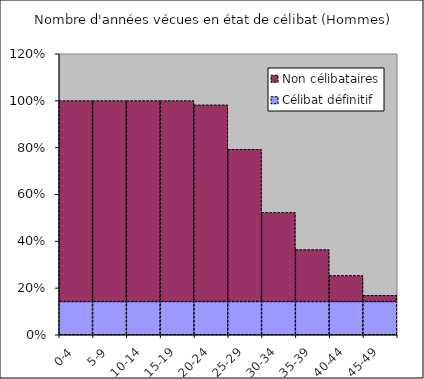
| Category | Célibat définitif | Non célibataires |
|---|---|---|
| 0-4 | 0.142 | 0.858 |
| 5-9 | 0.142 | 0.858 |
| 10-14 | 0.142 | 0.858 |
| 15-19 | 0.142 | 0.858 |
| 20-24 | 0.142 | 0.84 |
| 25-29 | 0.142 | 0.65 |
| 30-34 | 0.142 | 0.381 |
| 35-39 | 0.142 | 0.222 |
| 40-44 | 0.142 | 0.111 |
| 45-49 | 0.142 | 0.027 |